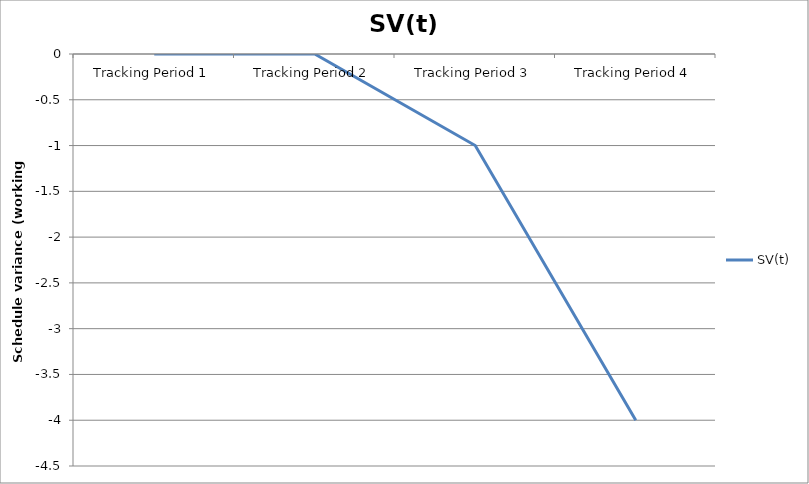
| Category | SV(t) |
|---|---|
| Tracking Period 1 | 0 |
| Tracking Period 2 | 0 |
| Tracking Period 3 | -1 |
| Tracking Period 4 | -4 |